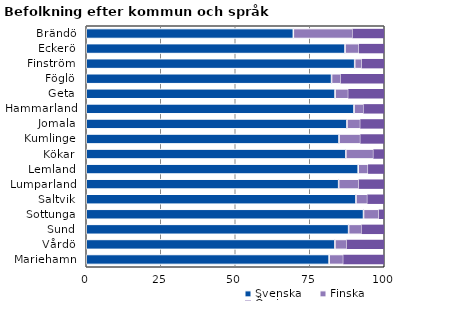
| Category | Svenska | Finska | Övriga |
|---|---|---|---|
| Brändö | 69.495 | 19.954 | 10.55 |
| Eckerö | 86.837 | 4.777 | 8.386 |
| Finström | 90.077 | 2.452 | 7.471 |
| Föglö | 82.318 | 3.143 | 14.538 |
| Geta | 83.497 | 4.519 | 11.984 |
| Hammarland | 89.854 | 3.281 | 6.865 |
| Jomala | 87.485 | 4.564 | 7.952 |
| Kumlinge | 84.828 | 7.241 | 7.931 |
| Kökar | 87.111 | 9.333 | 3.556 |
| Lemland | 91.255 | 3.385 | 5.36 |
| Lumparland | 84.699 | 6.831 | 8.47 |
| Saltvik | 90.508 | 3.908 | 5.583 |
| Sottunga | 93.043 | 5.217 | 1.739 |
| Sund | 88.04 | 4.422 | 7.538 |
| Vårdö | 83.439 | 4.034 | 12.527 |
| Mariehamn | 81.502 | 4.843 | 13.656 |